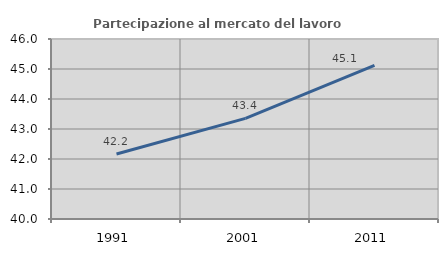
| Category | Partecipazione al mercato del lavoro  femminile |
|---|---|
| 1991.0 | 42.167 |
| 2001.0 | 43.355 |
| 2011.0 | 45.122 |